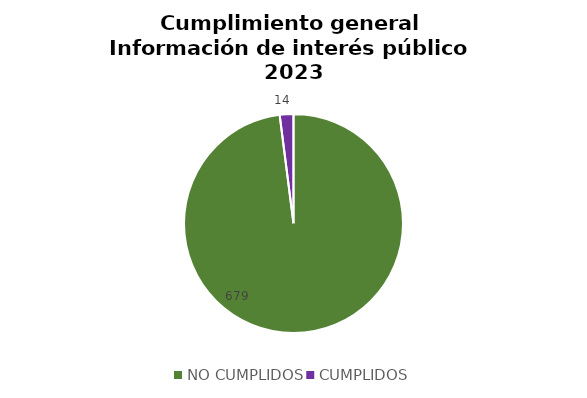
| Category | Series 0 |
|---|---|
| NO CUMPLIDOS | 679 |
| CUMPLIDOS | 14 |